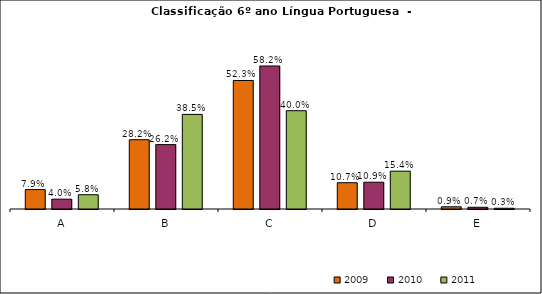
| Category | 2009 | 2010 | 2011 |
|---|---|---|---|
| A | 0.079 | 0.04 | 0.058 |
| B | 0.282 | 0.262 | 0.385 |
| C | 0.523 | 0.582 | 0.4 |
| D | 0.107 | 0.109 | 0.154 |
| E | 0.009 | 0.007 | 0.003 |